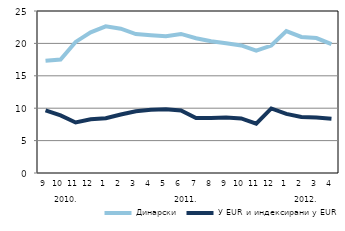
| Category | Динарски | У EUR и индексирани у EUR |
|---|---|---|
| 0 | 17.31 | 9.66 |
| 1900-01-01 | 17.5 | 8.88 |
| 1900-01-02 | 20.23 | 7.79 |
| 1900-01-03 | 21.71 | 8.28 |
| 1900-01-04 | 22.63 | 8.45 |
| 1900-01-05 | 22.27 | 9.02 |
| 1900-01-06 | 21.44 | 9.54 |
| 1900-01-07 | 21.24 | 9.77 |
| 1900-01-08 | 21.09 | 9.85 |
| 1900-01-09 | 21.46 | 9.65 |
| 1900-01-10 | 20.79 | 8.5 |
| 1900-01-11 | 20.33 | 8.49 |
| 1900-01-12 | 20.01 | 8.55 |
| 1900-01-13 | 19.69 | 8.42 |
| 1900-01-14 | 18.9 | 7.6 |
| 1900-01-15 | 19.67 | 9.96 |
| 1900-01-16 | 21.9 | 9.12 |
| 1900-01-17 | 20.99 | 8.65 |
| 1900-01-18 | 20.82 | 8.55 |
| 1900-01-19 | 19.89 | 8.36 |